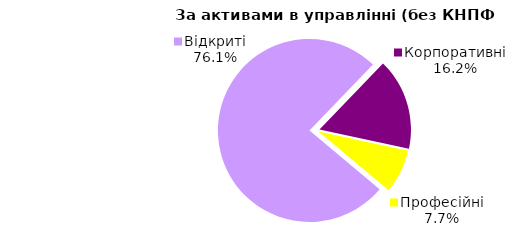
| Category | Series 0 |
|---|---|
| Відкриті | 1518.668 |
| Корпоративні | 322.906 |
| Професійні | 154.367 |